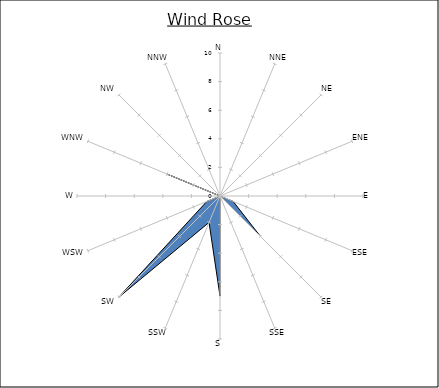
| Category | Series 0 |
|---|---|
| N | 0 |
| NNE | 0 |
| NE | 1 |
| ENE | 0 |
| E | 0 |
| ESE | 1 |
| SE | 4 |
| SSE | 0 |
| S | 7 |
| SSW | 2 |
| SW | 10 |
| WSW | 1 |
| W | 0 |
| WNW | 4 |
| NW | 0 |
| NNW | 0 |